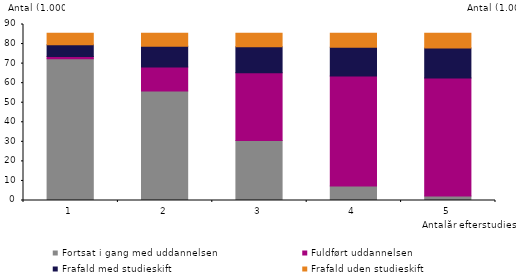
| Category | Fortsat i gang med uddannelsen | Fuldført uddannelsen | Frafald med studieskift | Frafald uden studieskift |
|---|---|---|---|---|
| 1.0 | 72465 | 1203 | 5968 | 5925 |
| 2.0 | 56020 | 12245 | 10567 | 6729 |
| 3.0 | 30621 | 34657 | 13321 | 6962 |
| 4.0 | 7471 | 56250 | 14637 | 7203 |
| 5.0 | 2327 | 60268 | 15380 | 7586 |